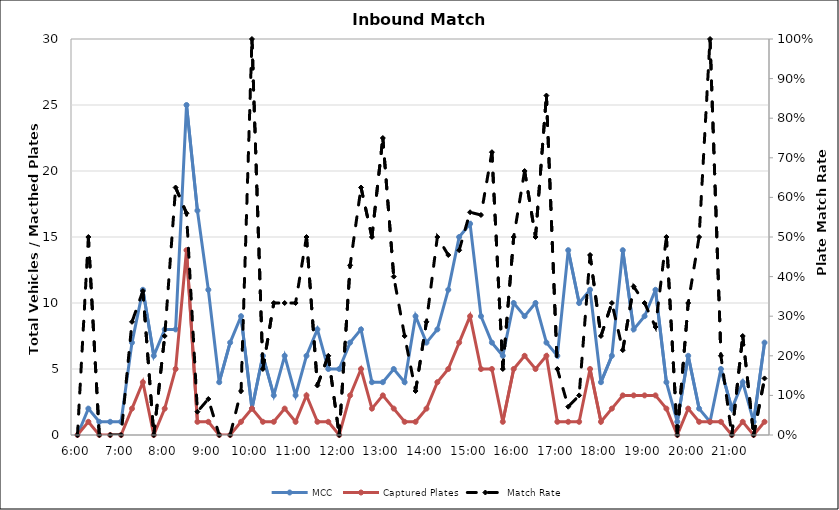
| Category | MCC | Captured Plates |
|---|---|---|
| 0.25 | 0 | 0 |
| 0.260416666666667 | 2 | 1 |
| 0.270833333333333 | 1 | 0 |
| 0.28125 | 1 | 0 |
| 0.291666666666667 | 1 | 0 |
| 0.302083333333333 | 7 | 2 |
| 0.3125 | 11 | 4 |
| 0.322916666666667 | 6 | 0 |
| 0.333333333333333 | 8 | 2 |
| 0.34375 | 8 | 5 |
| 0.354166666666667 | 25 | 14 |
| 0.364583333333333 | 17 | 1 |
| 0.375 | 11 | 1 |
| 0.385416666666667 | 4 | 0 |
| 0.395833333333333 | 7 | 0 |
| 0.40625 | 9 | 1 |
| 0.416666666666667 | 2 | 2 |
| 0.427083333333333 | 6 | 1 |
| 0.4375 | 3 | 1 |
| 0.447916666666667 | 6 | 2 |
| 0.458333333333333 | 3 | 1 |
| 0.46875 | 6 | 3 |
| 0.479166666666667 | 8 | 1 |
| 0.489583333333333 | 5 | 1 |
| 0.5 | 5 | 0 |
| 0.510416666666667 | 7 | 3 |
| 0.520833333333333 | 8 | 5 |
| 0.53125 | 4 | 2 |
| 0.541666666666667 | 4 | 3 |
| 0.552083333333333 | 5 | 2 |
| 0.5625 | 4 | 1 |
| 0.572916666666667 | 9 | 1 |
| 0.583333333333333 | 7 | 2 |
| 0.59375 | 8 | 4 |
| 0.604166666666667 | 11 | 5 |
| 0.614583333333333 | 15 | 7 |
| 0.625 | 16 | 9 |
| 0.635416666666667 | 9 | 5 |
| 0.645833333333333 | 7 | 5 |
| 0.65625 | 6 | 1 |
| 0.666666666666667 | 10 | 5 |
| 0.677083333333333 | 9 | 6 |
| 0.6875 | 10 | 5 |
| 0.697916666666667 | 7 | 6 |
| 0.708333333333333 | 6 | 1 |
| 0.71875 | 14 | 1 |
| 0.729166666666667 | 10 | 1 |
| 0.739583333333333 | 11 | 5 |
| 0.75 | 4 | 1 |
| 0.760416666666667 | 6 | 2 |
| 0.770833333333333 | 14 | 3 |
| 0.78125 | 8 | 3 |
| 0.791666666666667 | 9 | 3 |
| 0.802083333333333 | 11 | 3 |
| 0.8125 | 4 | 2 |
| 0.822916666666667 | 1 | 0 |
| 0.833333333333333 | 6 | 2 |
| 0.84375 | 2 | 1 |
| 0.854166666666667 | 1 | 1 |
| 0.864583333333333 | 5 | 1 |
| 0.875 | 2 | 0 |
| 0.885416666666667 | 4 | 1 |
| 0.895833333333333 | 1 | 0 |
| 0.90625 | 7 | 1 |